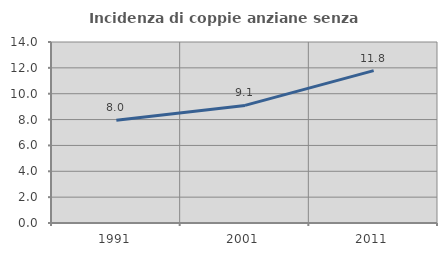
| Category | Incidenza di coppie anziane senza figli  |
|---|---|
| 1991.0 | 7.951 |
| 2001.0 | 9.096 |
| 2011.0 | 11.788 |